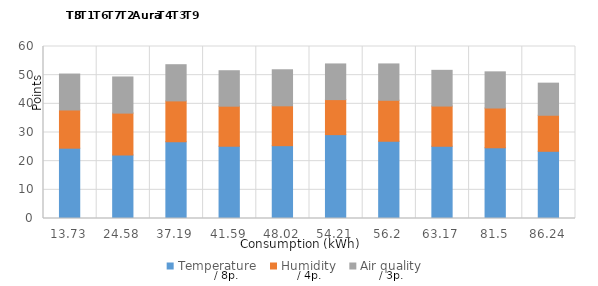
| Category | Temperature | Humidity | Air quality |
|---|---|---|---|
| 13.73 | 24.53 | 13.328 | 12.535 |
| 24.58 | 22.148 | 14.614 | 12.61 |
| 37.19 | 26.745 | 14.279 | 12.626 |
| 41.59 | 25.21 | 13.971 | 12.371 |
| 48.02 | 25.402 | 13.904 | 12.579 |
| 54.21 | 29.25 | 12.224 | 12.443 |
| 56.199999999999996 | 26.986 | 14.255 | 12.68 |
| 63.169999999999995 | 25.202 | 14.023 | 12.46 |
| 81.5 | 24.665 | 13.876 | 12.616 |
| 86.24 | 23.441 | 12.572 | 11.203 |